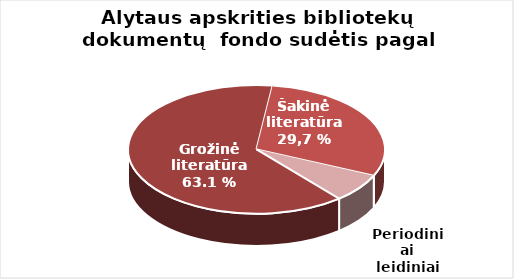
| Category | Series 0 |
|---|---|
| Grožinė literatūra* | 620815 |
| Šakinė literatūra* | 292408 |
| period. | 70402 |